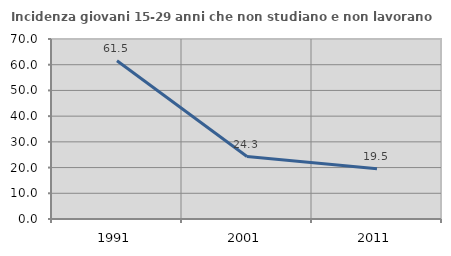
| Category | Incidenza giovani 15-29 anni che non studiano e non lavorano  |
|---|---|
| 1991.0 | 61.538 |
| 2001.0 | 24.294 |
| 2011.0 | 19.52 |